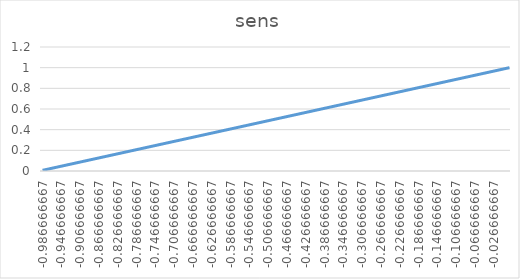
| Category | sens |
|---|---|
| -0.9866666666666667 | 0.007 |
| -0.98 | 0.013 |
| -0.9733333333333334 | 0.02 |
| -0.9666666666666667 | 0.027 |
| -0.96 | 0.033 |
| -0.9533333333333334 | 0.04 |
| -0.9466666666666667 | 0.047 |
| -0.94 | 0.053 |
| -0.9333333333333333 | 0.06 |
| -0.9266666666666666 | 0.067 |
| -0.92 | 0.073 |
| -0.9133333333333333 | 0.08 |
| -0.9066666666666666 | 0.087 |
| -0.9 | 0.093 |
| -0.8933333333333333 | 0.1 |
| -0.8866666666666667 | 0.107 |
| -0.88 | 0.113 |
| -0.8733333333333333 | 0.12 |
| -0.8666666666666667 | 0.127 |
| -0.86 | 0.133 |
| -0.8533333333333334 | 0.14 |
| -0.8466666666666667 | 0.147 |
| -0.84 | 0.153 |
| -0.8333333333333334 | 0.16 |
| -0.8266666666666667 | 0.167 |
| -0.82 | 0.173 |
| -0.8133333333333334 | 0.18 |
| -0.8066666666666666 | 0.187 |
| -0.8 | 0.193 |
| -0.7933333333333333 | 0.2 |
| -0.7866666666666666 | 0.207 |
| -0.78 | 0.213 |
| -0.7733333333333333 | 0.22 |
| -0.7666666666666667 | 0.227 |
| -0.76 | 0.233 |
| -0.7533333333333333 | 0.24 |
| -0.7466666666666667 | 0.247 |
| -0.74 | 0.253 |
| -0.7333333333333333 | 0.26 |
| -0.7266666666666667 | 0.267 |
| -0.72 | 0.273 |
| -0.7133333333333334 | 0.28 |
| -0.7066666666666667 | 0.287 |
| -0.7 | 0.293 |
| -0.6933333333333334 | 0.3 |
| -0.6866666666666666 | 0.307 |
| -0.68 | 0.313 |
| -0.6733333333333333 | 0.32 |
| -0.6666666666666666 | 0.327 |
| -0.66 | 0.333 |
| -0.6533333333333333 | 0.34 |
| -0.6466666666666666 | 0.347 |
| -0.64 | 0.353 |
| -0.6333333333333333 | 0.36 |
| -0.6266666666666667 | 0.367 |
| -0.62 | 0.373 |
| -0.6133333333333333 | 0.38 |
| -0.6066666666666667 | 0.387 |
| -0.6 | 0.393 |
| -0.5933333333333334 | 0.4 |
| -0.5866666666666667 | 0.407 |
| -0.58 | 0.413 |
| -0.5733333333333334 | 0.42 |
| -0.5666666666666667 | 0.427 |
| -0.56 | 0.433 |
| -0.5533333333333333 | 0.44 |
| -0.5466666666666666 | 0.447 |
| -0.54 | 0.453 |
| -0.5333333333333333 | 0.46 |
| -0.5266666666666666 | 0.467 |
| -0.52 | 0.473 |
| -0.5133333333333333 | 0.48 |
| -0.5066666666666667 | 0.487 |
| -0.5 | 0.493 |
| -0.49333333333333335 | 0.5 |
| -0.4866666666666667 | 0.507 |
| -0.48 | 0.513 |
| -0.47333333333333333 | 0.52 |
| -0.4666666666666667 | 0.527 |
| -0.46 | 0.533 |
| -0.4533333333333333 | 0.54 |
| -0.44666666666666666 | 0.547 |
| -0.44 | 0.553 |
| -0.43333333333333335 | 0.56 |
| -0.4266666666666667 | 0.567 |
| -0.42 | 0.573 |
| -0.41333333333333333 | 0.58 |
| -0.4066666666666667 | 0.587 |
| -0.4 | 0.593 |
| -0.3933333333333333 | 0.6 |
| -0.38666666666666666 | 0.607 |
| -0.38 | 0.613 |
| -0.37333333333333335 | 0.62 |
| -0.36666666666666664 | 0.627 |
| -0.36 | 0.633 |
| -0.35333333333333333 | 0.64 |
| -0.3466666666666667 | 0.647 |
| -0.34 | 0.653 |
| -0.3333333333333333 | 0.66 |
| -0.32666666666666666 | 0.667 |
| -0.32 | 0.673 |
| -0.31333333333333335 | 0.68 |
| -0.30666666666666664 | 0.687 |
| -0.3 | 0.693 |
| -0.29333333333333333 | 0.7 |
| -0.2866666666666667 | 0.707 |
| -0.28 | 0.713 |
| -0.2733333333333333 | 0.72 |
| -0.26666666666666666 | 0.727 |
| -0.26 | 0.733 |
| -0.25333333333333335 | 0.74 |
| -0.24666666666666667 | 0.747 |
| -0.24 | 0.753 |
| -0.23333333333333334 | 0.76 |
| -0.22666666666666666 | 0.767 |
| -0.22 | 0.773 |
| -0.21333333333333335 | 0.78 |
| -0.20666666666666667 | 0.787 |
| -0.2 | 0.793 |
| -0.19333333333333333 | 0.8 |
| -0.18666666666666668 | 0.807 |
| -0.18 | 0.813 |
| -0.17333333333333334 | 0.82 |
| -0.16666666666666666 | 0.827 |
| -0.16 | 0.833 |
| -0.15333333333333332 | 0.84 |
| -0.14666666666666667 | 0.847 |
| -0.14 | 0.853 |
| -0.13333333333333333 | 0.86 |
| -0.12666666666666668 | 0.867 |
| -0.12 | 0.873 |
| -0.11333333333333333 | 0.88 |
| -0.10666666666666667 | 0.887 |
| -0.1 | 0.893 |
| -0.09333333333333334 | 0.9 |
| -0.08666666666666667 | 0.907 |
| -0.08 | 0.913 |
| -0.07333333333333333 | 0.92 |
| -0.06666666666666667 | 0.927 |
| -0.06 | 0.933 |
| -0.05333333333333334 | 0.94 |
| -0.04666666666666667 | 0.947 |
| -0.04 | 0.953 |
| -0.03333333333333333 | 0.96 |
| -0.02666666666666667 | 0.967 |
| -0.02 | 0.973 |
| -0.013333333333333334 | 0.98 |
| -0.006666666666666667 | 0.987 |
| 0.0 | 0.993 |
| 0.006666666666666667 | 1 |